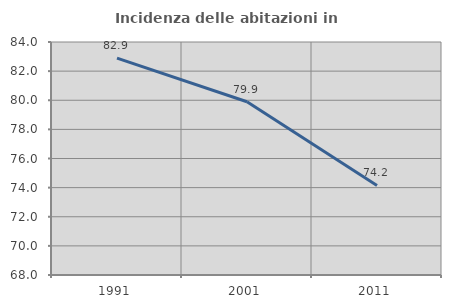
| Category | Incidenza delle abitazioni in proprietà  |
|---|---|
| 1991.0 | 82.89 |
| 2001.0 | 79.894 |
| 2011.0 | 74.151 |